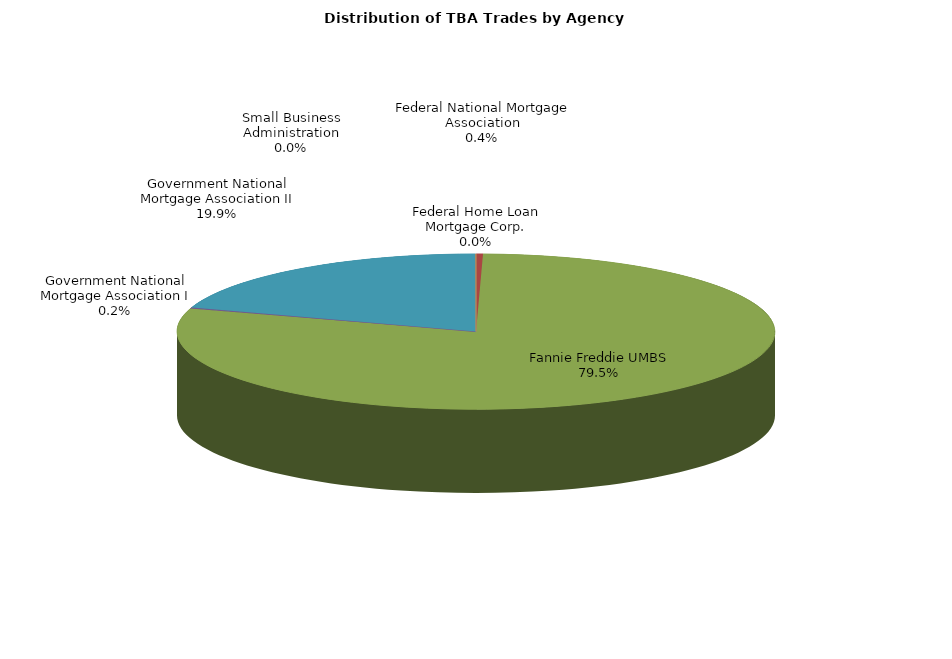
| Category | Series 0 |
|---|---|
| Federal Home Loan Mortgage Corp. | 0.782 |
| Federal National Mortgage Association | 27.036 |
| Fannie Freddie UMBS | 5930.631 |
| Government National Mortgage Association I | 16.016 |
| Government National Mortgage Association II | 1488.512 |
| Small Business Administration | 1.214 |